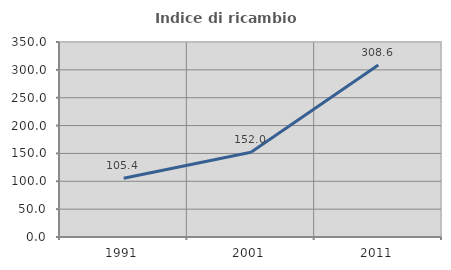
| Category | Indice di ricambio occupazionale  |
|---|---|
| 1991.0 | 105.363 |
| 2001.0 | 152.009 |
| 2011.0 | 308.563 |